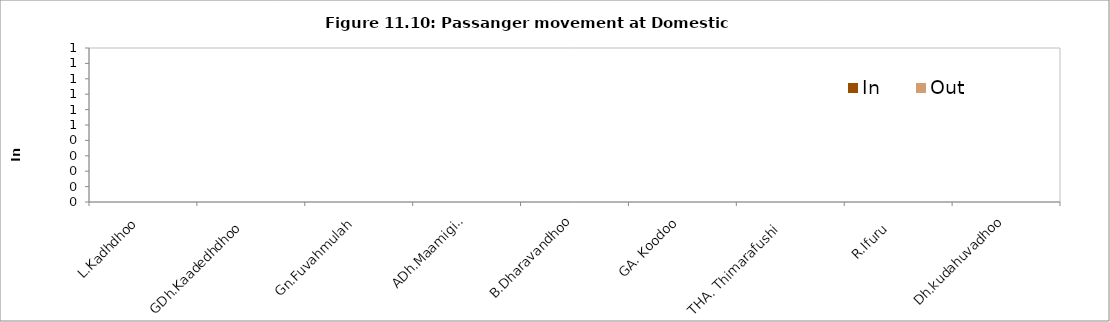
| Category | In | Out |
|---|---|---|
|  L.Kadhdhoo  | 0 | 0 |
|  GDh.Kaadedhdhoo  | 0 | 0 |
| Gn.Fuvahmulah  | 0 | 0 |
| ADh.Maamigili | 0 | 0 |
| B.Dharavandhoo | 0 | 0 |
| GA. Koodoo | 0 | 0 |
| THA. Thimarafushi   | 0 | 0 |
| R.Ifuru   | 0 | 0 |
| Dh.kudahuvadhoo | 0 | 0 |